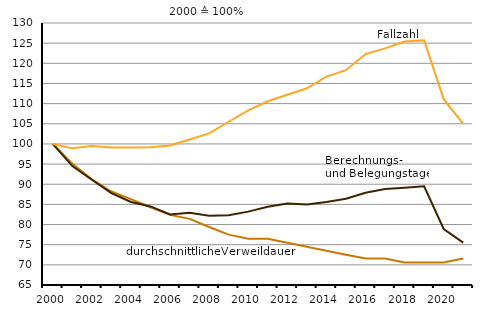
| Category | Durchschnittliche Verweildauer | Berechnungs- und Belegungstage | Fallzahl |
|---|---|---|---|
| 2000.0 | 100 | 100 | 100 |
| 2001.0 | 95.1 | 94.5 | 98.9 |
| 2002.0 | 91.2 | 91.1 | 99.5 |
| 2003.0 | 88.2 | 87.8 | 99.1 |
| 2004.0 | 86.3 | 85.6 | 99.1 |
| 2005.0 | 84.3 | 84.5 | 99.2 |
| 2006.0 | 82.4 | 82.5 | 99.6 |
| 2007.0 | 81.4 | 82.9 | 101.1 |
| 2008.0 | 79.4 | 82.2 | 102.6 |
| 2009.0 | 77.5 | 82.3 | 105.5 |
| 2010.0 | 76.5 | 83.2 | 108.3 |
| 2011.0 | 76.5 | 84.4 | 110.6 |
| 2012.0 | 75.5 | 85.2 | 112.2 |
| 2013.0 | 74.5 | 85 | 113.8 |
| 2014.0 | 73.5 | 85.6 | 116.7 |
| 2015.0 | 72.5 | 86.4 | 118.3 |
| 2016.0 | 71.6 | 87.9 | 122.3 |
| 2017.0 | 71.6 | 88.8 | 123.7 |
| 2018.0 | 70.6 | 89.1 | 125.4 |
| 2019.0 | 70.6 | 89.5 | 125.7 |
| 2020.0 | 70.6 | 78.9 | 111.1 |
| 2021.0 | 71.6 | 75.5 | 105 |